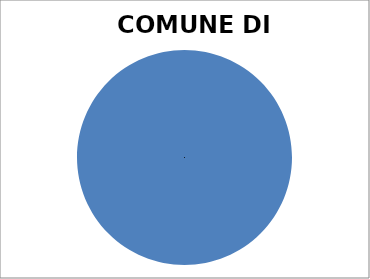
| Category | COMUNE DI MUSSOMELI |
|---|---|
| 0 | 100 |